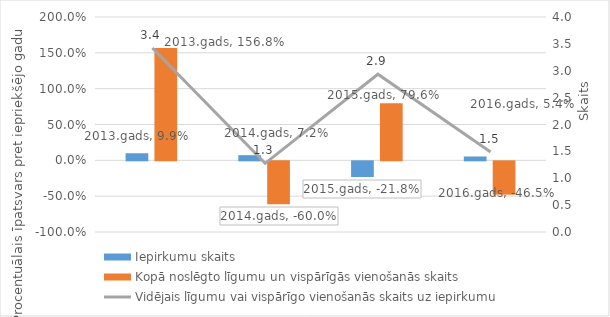
| Category | Iepirkumu skaits | Kopā noslēgto līgumu un vispārīgās vienošanās skaits |
|---|---|---|
| 2013.gads | 0.099 | 1.568 |
| 2014.gads | 0.072 | -0.6 |
| 2015.gads | -0.218 | 0.796 |
| 2016.gads | 0.054 | -0.465 |